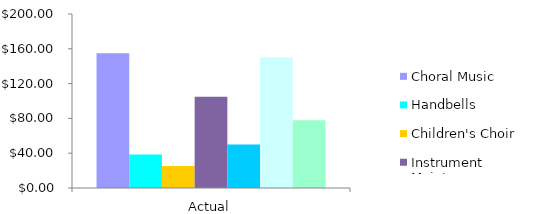
| Category | Choral Music | Handbells | Children's Choir | Instrument Maintenance | Guest Musician | Substitute | Supplies |
|---|---|---|---|---|---|---|---|
| 0 | 155 | 38.5 | 25.25 | 105 | 50 | 150 | 78 |